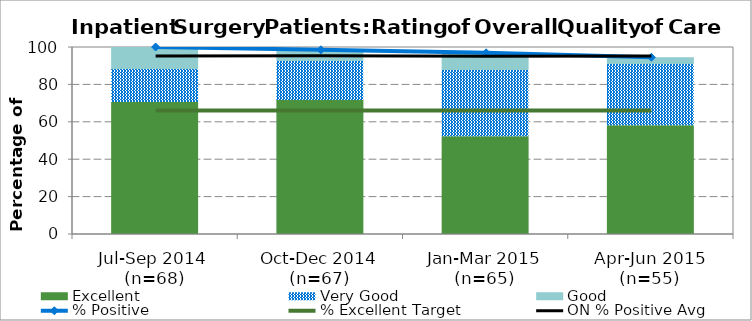
| Category | Excellent | Very Good | Good |
|---|---|---|---|
| Jul-Sep 2014 
(n=68) | 70.59 | 17.65 | 11.76 |
| Oct-Dec 2014 (n=67) | 71.64 | 20.9 | 5.97 |
| Jan-Mar 2015 (n=65) | 52.3 | 35.4 | 9.2 |
| Apr-Jun 2015 (n=55) | 58.2 | 32.7 | 3.6 |